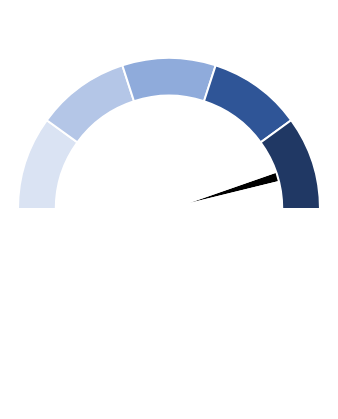
| Category | Series 1 |
|---|---|
| 0 | 90 |
| 1 | 3 |
| 2 | 108.5 |